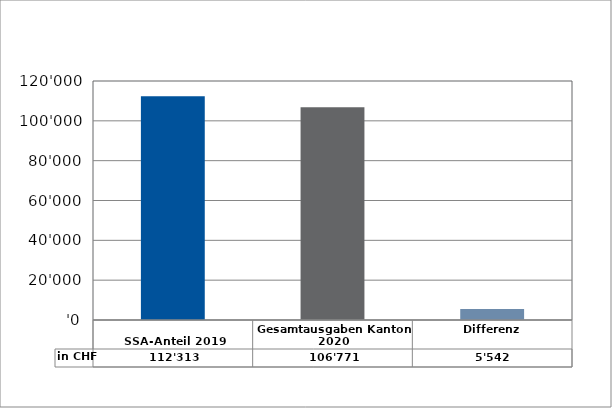
| Category | in CHF |
|---|---|
| 
SSA-Anteil 2019

 | 112313 |
| Gesamtausgaben Kanton 2020
 | 106770.9 |
| Differenz | 5542.1 |